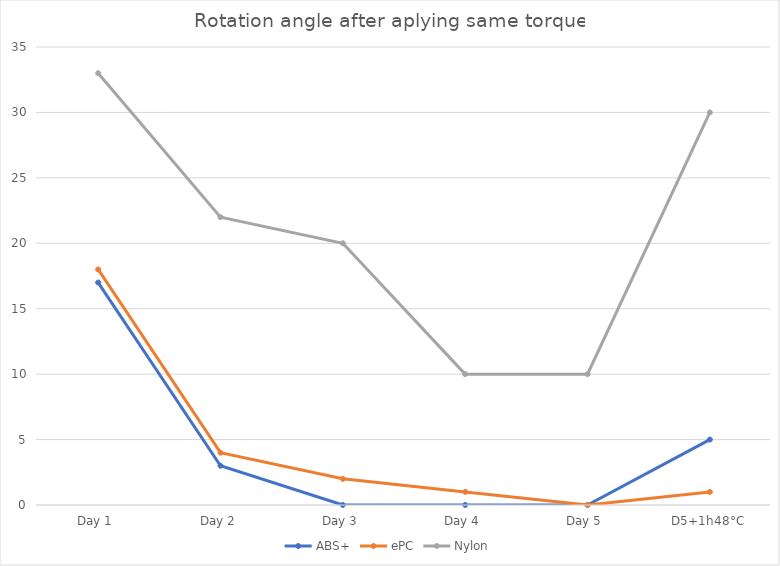
| Category | ABS+ | ePC | Nylon |
|---|---|---|---|
| Day 1 | 17 | 18 | 33 |
| Day 2 | 3 | 4 | 22 |
| Day 3 | 0 | 2 | 20 |
| Day 4 | 0 | 1 | 10 |
| Day 5 | 0 | 0 | 10 |
| D5+1h48°C | 5 | 1 | 30 |